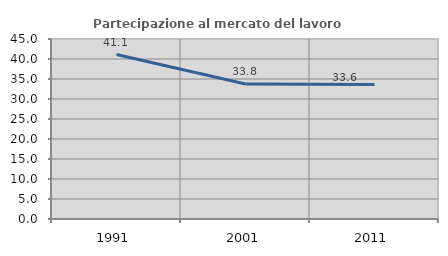
| Category | Partecipazione al mercato del lavoro  femminile |
|---|---|
| 1991.0 | 41.104 |
| 2001.0 | 33.77 |
| 2011.0 | 33.614 |